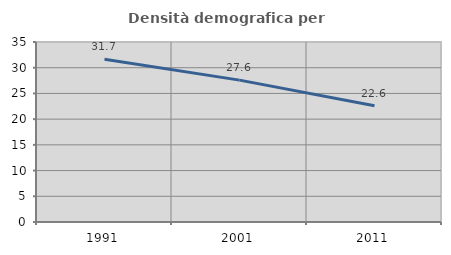
| Category | Densità demografica |
|---|---|
| 1991.0 | 31.653 |
| 2001.0 | 27.586 |
| 2011.0 | 22.622 |